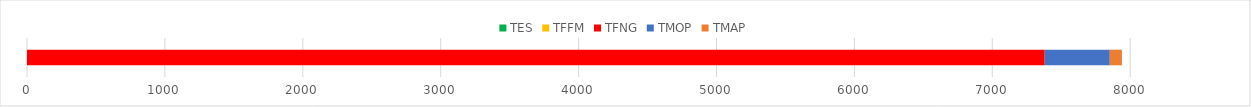
| Category | TES | TFFM | TFNG | TMOP | TMAP |
|---|---|---|---|---|---|
| 0 | 0 | 0 | 7380 | 472 | 88 |